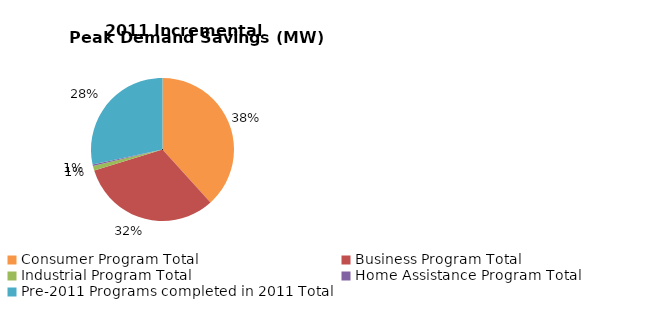
| Category | Incremental Peak Demand Savings (kW) |
|---|---|
| Consumer Program Total | 218.26 |
| Business Program Total | 182.082 |
| Industrial Program Total | 6.033 |
| Home Assistance Program Total | 2.027 |
| Pre-2011 Programs completed in 2011 Total | 161.636 |